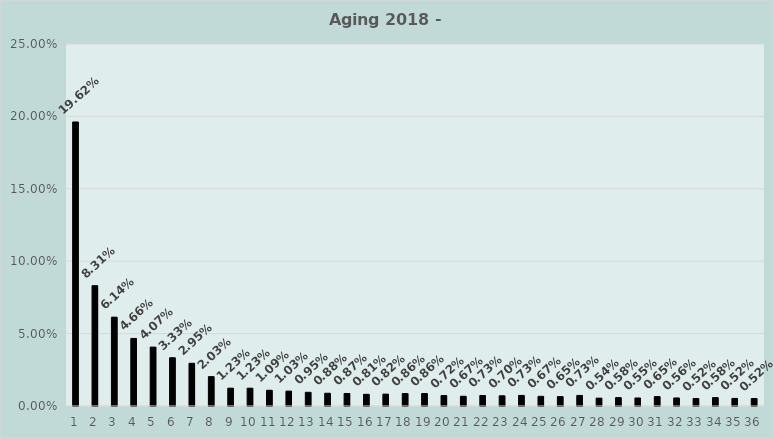
| Category | Series 0 |
|---|---|
| 0 | 0.196 |
| 1 | 0.083 |
| 2 | 0.061 |
| 3 | 0.047 |
| 4 | 0.041 |
| 5 | 0.033 |
| 6 | 0.03 |
| 7 | 0.02 |
| 8 | 0.012 |
| 9 | 0.012 |
| 10 | 0.011 |
| 11 | 0.01 |
| 12 | 0.009 |
| 13 | 0.009 |
| 14 | 0.009 |
| 15 | 0.008 |
| 16 | 0.008 |
| 17 | 0.009 |
| 18 | 0.009 |
| 19 | 0.007 |
| 20 | 0.007 |
| 21 | 0.007 |
| 22 | 0.007 |
| 23 | 0.007 |
| 24 | 0.007 |
| 25 | 0.006 |
| 26 | 0.007 |
| 27 | 0.005 |
| 28 | 0.006 |
| 29 | 0.006 |
| 30 | 0.007 |
| 31 | 0.006 |
| 32 | 0.005 |
| 33 | 0.006 |
| 34 | 0.005 |
| 35 | 0.005 |